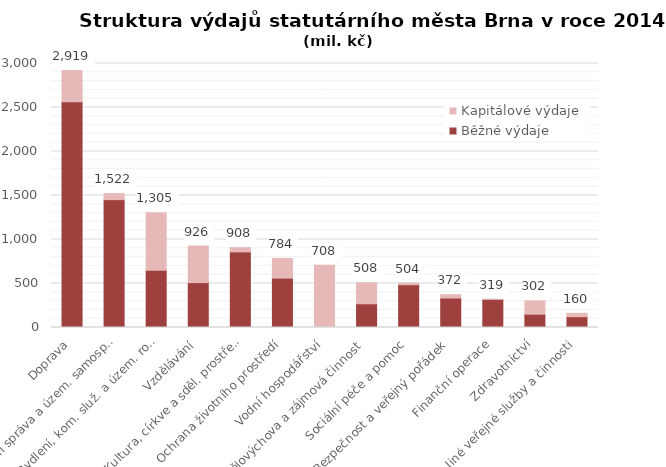
| Category | Běžné výdaje | Kapitálové výdaje |
|---|---|---|
| Doprava | 2565.105 | 354.029 |
| Státní správa a územ. samospráva | 1452.859 | 69.002 |
| Bydlení, kom. služ. a územ. rozvoj | 650.787 | 654.062 |
| Vzdělávání | 510.296 | 415.59 |
| Kultura, církve a sděl. prostředky | 859.374 | 48.408 |
| Ochrana životního prostředí | 561.128 | 222.696 |
| Vodní hospodářství | 7.601 | 700.38 |
| Tělovýchova a zájmová činnost | 269.361 | 238.797 |
| Sociální péče a pomoc | 485.916 | 17.811 |
| Bezpečnost a veřejný pořádek | 334.834 | 37.659 |
| Finanční operace | 319.238 | 0.015 |
| Zdravotnictví | 151.088 | 150.546 |
| Jiné veřejné služby a činnosti | 122.599 | 37.538 |